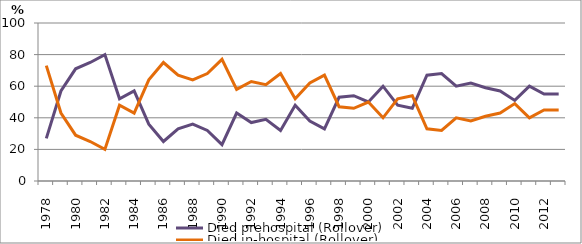
| Category | Died prehospital (Rollover) | Died in-hospital (Rollover) |
|---|---|---|
| 1978.0 | 27 | 73 |
| 1979.0 | 57 | 43 |
| 1980.0 | 71 | 29 |
| 1981.0 | 75 | 25 |
| 1982.0 | 80 | 20 |
| 1983.0 | 52 | 48 |
| 1984.0 | 57 | 43 |
| 1985.0 | 36 | 64 |
| 1986.0 | 25 | 75 |
| 1987.0 | 33 | 67 |
| 1988.0 | 36 | 64 |
| 1989.0 | 32 | 68 |
| 1990.0 | 23 | 77 |
| 1991.0 | 43 | 58 |
| 1992.0 | 37 | 63 |
| 1993.0 | 39 | 61 |
| 1994.0 | 32 | 68 |
| 1995.0 | 48 | 52 |
| 1996.0 | 38 | 62 |
| 1997.0 | 33 | 67 |
| 1998.0 | 53 | 47 |
| 1999.0 | 54 | 46 |
| 2000.0 | 50 | 50 |
| 2001.0 | 60 | 40 |
| 2002.0 | 48 | 52 |
| 2003.0 | 46 | 54 |
| 2004.0 | 67 | 33 |
| 2005.0 | 68 | 32 |
| 2006.0 | 60 | 40 |
| 2007.0 | 62 | 38 |
| 2008.0 | 59 | 41 |
| 2009.0 | 57 | 43 |
| 2010.0 | 51 | 49 |
| 2011.0 | 60 | 40 |
| 2012.0 | 55 | 45 |
| 2013.0 | 55 | 45 |